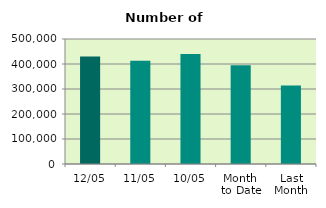
| Category | Series 0 |
|---|---|
| 12/05 | 430404 |
| 11/05 | 413150 |
| 10/05 | 439686 |
| Month 
to Date | 394936 |
| Last
Month | 313751.158 |